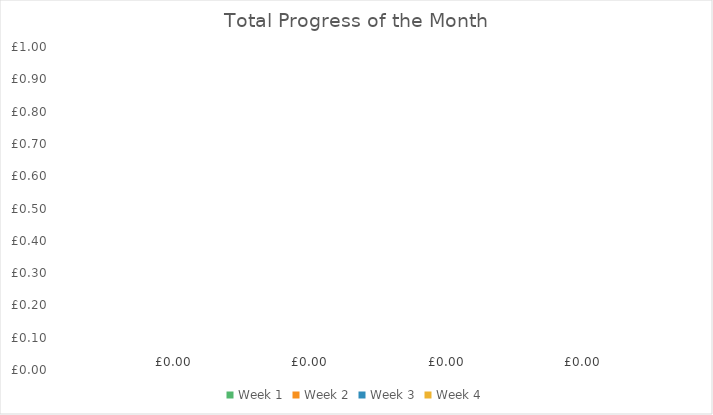
| Category | Week 1 | Week 2 | Week 3 | Week 4 |
|---|---|---|---|---|
| 0 | 0 | 0 | 0 | 0 |